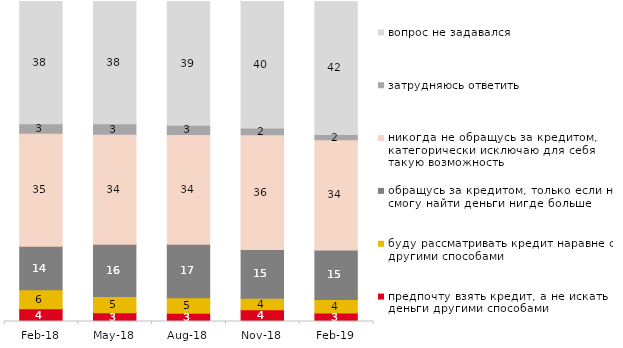
| Category | предпочту взять кредит, а не искать деньги другими способами | буду рассматривать кредит наравне с другими способами | обращусь за кредитом, только если не смогу найти деньги нигде больше | никогда не обращусь за кредитом, категорически исключаю для себя такую возможность | затрудняюсь ответить | вопрос не задавался |
|---|---|---|---|---|---|---|
| 2018-02-01 | 4 | 5.9 | 13.6 | 35.3 | 3 | 38.2 |
| 2018-05-01 | 2.75 | 5.05 | 16.35 | 34.35 | 3.3 | 38.2 |
| 2018-08-01 | 2.55 | 4.9 | 16.7 | 34.25 | 2.9 | 38.7 |
| 2018-11-01 | 3.643 | 3.593 | 15.269 | 35.878 | 2.096 | 39.521 |
| 2019-02-01 | 2.65 | 4.25 | 15.45 | 34.45 | 1.65 | 41.55 |